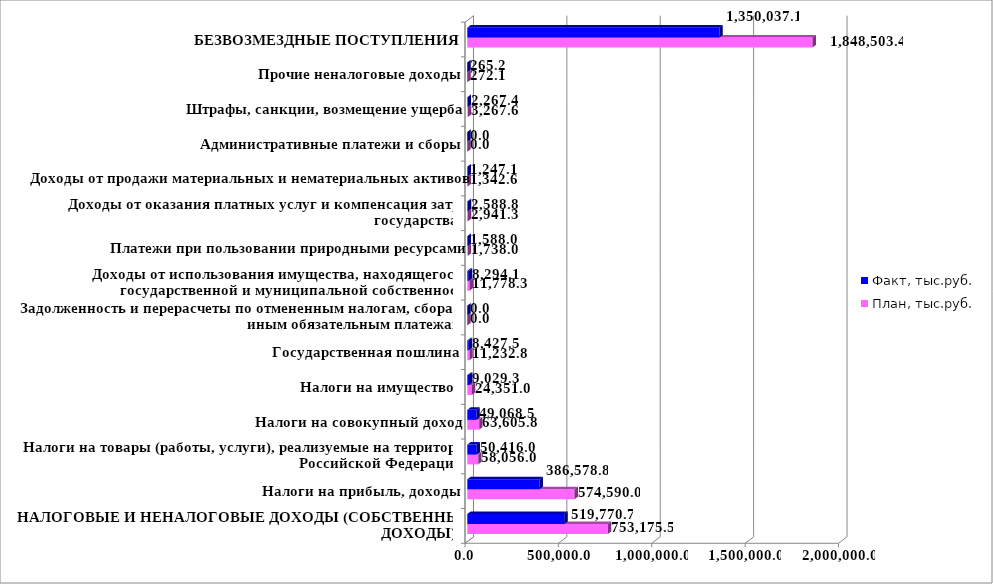
| Category | План, тыс.руб. | Факт, тыс.руб. |
|---|---|---|
| НАЛОГОВЫЕ И НЕНАЛОГОВЫЕ ДОХОДЫ (СОБСТВЕННЫЕ ДОХОДЫ) | 753175.5 | 519770.7 |
| Налоги на прибыль, доходы | 574590 | 386578.8 |
| Налоги на товары (работы, услуги), реализуемые на территории Российской Федерации | 58056 | 50416 |
| Налоги на совокупный доход | 63605.8 | 49068.5 |
| Налоги на имущество  | 24351 | 9029.3 |
| Государственная пошлина | 11232.8 | 8427.5 |
| Задолженность и перерасчеты по отмененным налогам, сборам и иным обязательным платежам | 0 | 0 |
| Доходы от использования имущества, находящегося в государственной и муниципальной собственности | 11778.3 | 8294.1 |
| Платежи при пользовании природными ресурсами | 1738 | 1588 |
| Доходы от оказания платных услуг и компенсация затрат государства | 2941.3 | 2588.8 |
| Доходы от продажи материальных и нематериальных активов | 1342.6 | 1247.1 |
| Административные платежи и сборы | 0 | 0 |
| Штрафы, санкции, возмещение ущерба | 3267.6 | 2267.4 |
| Прочие неналоговые доходы | 272.1 | 265.2 |
| БЕЗВОЗМЕЗДНЫЕ ПОСТУПЛЕНИЯ | 1848503.4 | 1350037.1 |